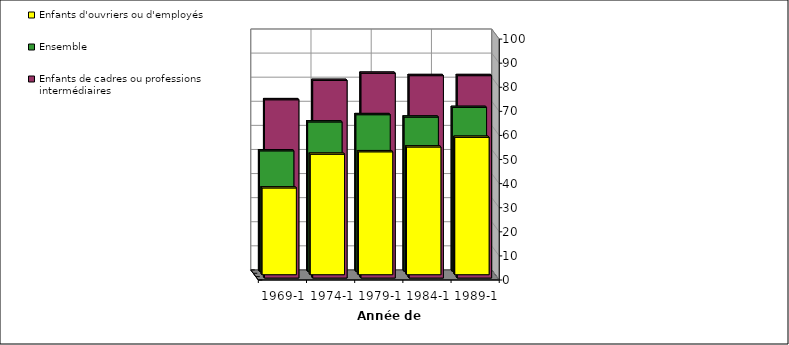
| Category | Enfants d'ouvriers ou d'employés | Ensemble | Enfants de cadres ou professions intermédiaires |
|---|---|---|---|
| 1969-1973 | 36 | 50 | 74 |
| 1974-1978 | 50 | 62 | 82 |
| 1979-1983 | 51 | 65 | 85 |
| 1984-1988 | 53 | 64 | 84 |
| 1989-1993p | 57 | 68 | 84 |